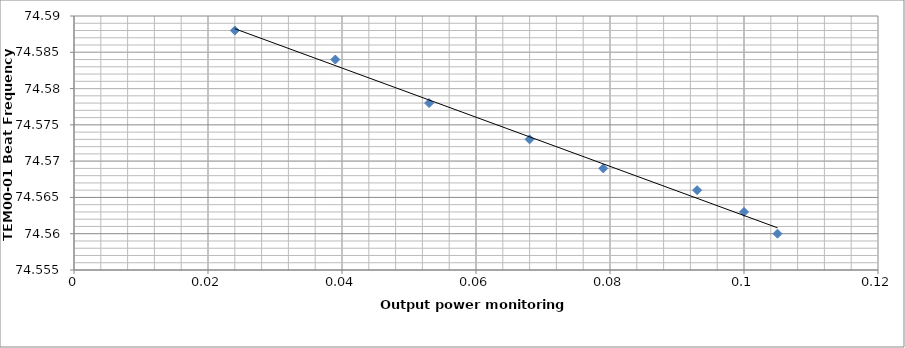
| Category | Series 0 |
|---|---|
| 0.105 | 74.56 |
| 0.1 | 74.563 |
| 0.093 | 74.566 |
| 0.079 | 74.569 |
| 0.068 | 74.573 |
| 0.053 | 74.578 |
| 0.039 | 74.584 |
| 0.024 | 74.588 |